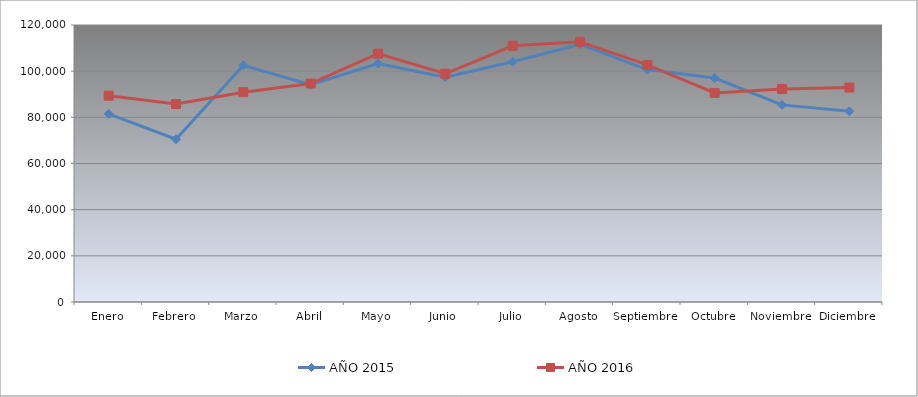
| Category | AÑO 2015 | AÑO 2016 |
|---|---|---|
| Enero | 81514.937 | 89353.775 |
| Febrero | 70519.899 | 85743.745 |
| Marzo | 102520.709 | 90907.786 |
| Abril | 94099.443 | 94643.318 |
| Mayo | 103308.152 | 107584.795 |
| Junio | 97402.329 | 98873.475 |
| Julio | 104095.595 | 110988.115 |
| Agosto | 111656.506 | 112730.379 |
| Septiembre | 100705.215 | 102719.744 |
| Octubre | 97008.608 | 90582.957 |
| Noviembre | 85393.823 | 92295.691 |
| Diciembre | 82637.772 | 92893.671 |